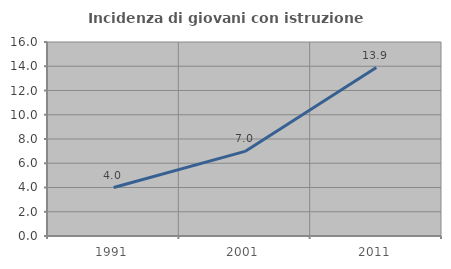
| Category | Incidenza di giovani con istruzione universitaria |
|---|---|
| 1991.0 | 4 |
| 2001.0 | 6.977 |
| 2011.0 | 13.889 |